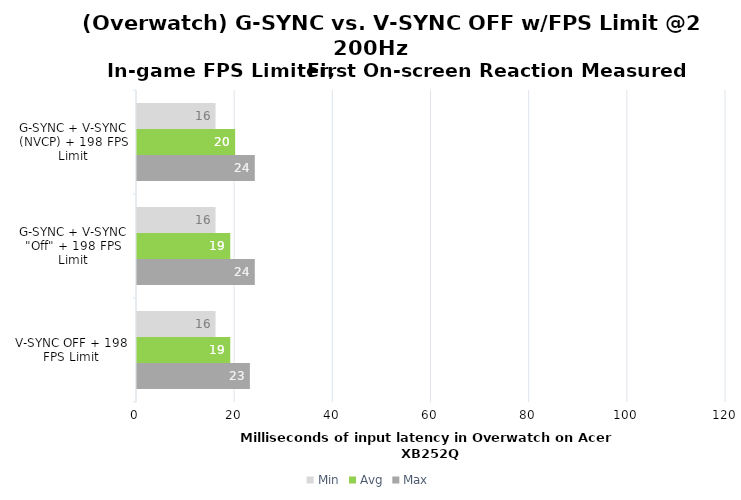
| Category | Min | Avg | Max |
|---|---|---|---|
| G-SYNC + V-SYNC (NVCP) + 198 FPS Limit | 16 | 20 | 24 |
| G-SYNC + V-SYNC "Off" + 198 FPS Limit | 16 | 19 | 24 |
| V-SYNC OFF + 198 FPS Limit | 16 | 19 | 23 |